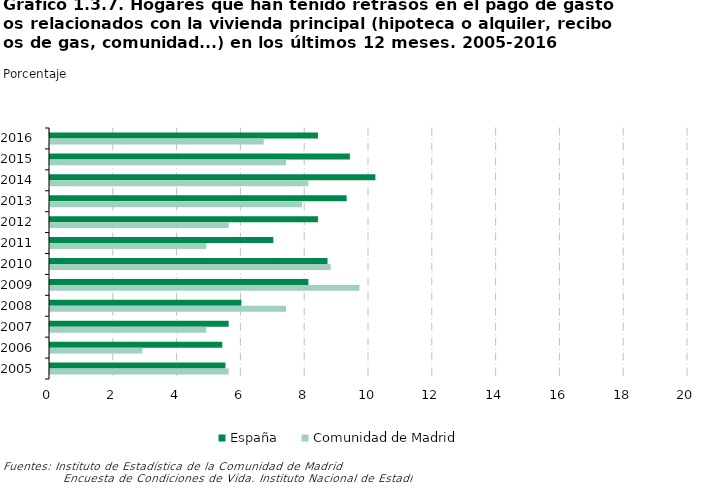
| Category | España | Comunidad de Madrid |
|---|---|---|
| 2016 | 8.4 | 6.7 |
| 2015 | 9.4 | 7.4 |
| 2014 | 10.2 | 8.1 |
| 2013 | 9.3 | 7.9 |
| 2012 | 8.4 | 5.6 |
| 2011 | 7 | 4.9 |
| 2010 | 8.7 | 8.8 |
| 2009 | 8.1 | 9.7 |
| 2008 | 6 | 7.4 |
| 2007 | 5.6 | 4.9 |
| 2006 | 5.4 | 2.9 |
| 2005 | 5.5 | 5.6 |